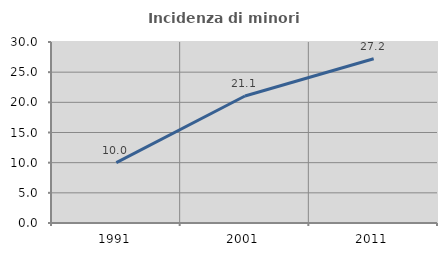
| Category | Incidenza di minori stranieri |
|---|---|
| 1991.0 | 10 |
| 2001.0 | 21.053 |
| 2011.0 | 27.214 |